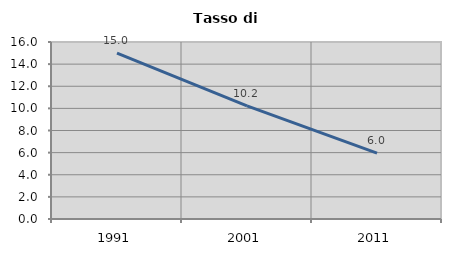
| Category | Tasso di disoccupazione   |
|---|---|
| 1991.0 | 15 |
| 2001.0 | 10.227 |
| 2011.0 | 5.952 |